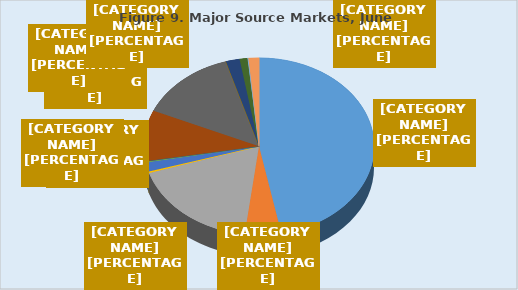
| Category | Country |
|---|---|
| Australia | 0.469 |
| China | 0.051 |
| Fiji | 0.181 |
| Indonesia | 0.003 |
| Japan | 0.017 |
| Korea | 0.002 |
| Malaysia | 0.001 |
| New Zealand | 0.093 |
| Singapore | 0.138 |
| Thailand | 0 |
| Taiwan | 0.019 |
| United States of America | 0.011 |
| Vietnam | 0.001 |
| Other countries | 0.015 |